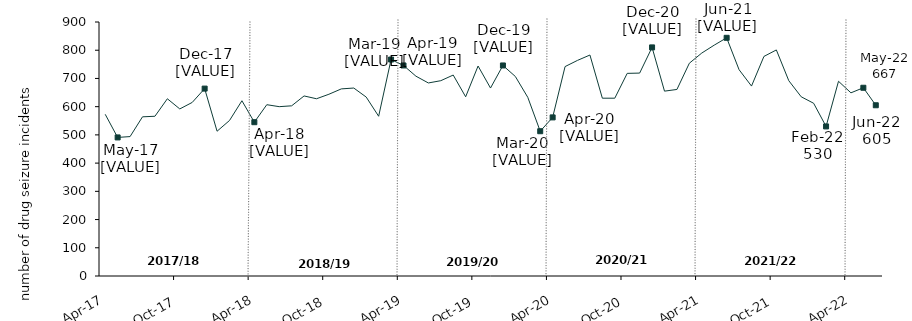
| Category | Number of drug seizure incidents |
|---|---|
| 2017-04-01 | 573 |
| 2017-05-01 | 491 |
| 2017-06-01 | 494 |
| 2017-07-01 | 564 |
| 2017-08-01 | 566 |
| 2017-09-01 | 628 |
| 2017-10-01 | 592 |
| 2017-11-01 | 615 |
| 2017-12-01 | 664 |
| 2018-01-01 | 513 |
| 2018-02-01 | 551 |
| 2018-03-01 | 621 |
| 2018-04-01 | 545 |
| 2018-05-01 | 607 |
| 2018-06-01 | 600 |
| 2018-07-01 | 603 |
| 2018-08-01 | 638 |
| 2018-09-01 | 628 |
| 2018-10-01 | 644 |
| 2018-11-01 | 663 |
| 2018-12-01 | 666 |
| 2019-01-01 | 634 |
| 2019-02-01 | 566 |
| 2019-03-01 | 767 |
| 2019-04-01 | 746 |
| 2019-05-01 | 708 |
| 2019-06-01 | 684 |
| 2019-07-01 | 692 |
| 2019-08-01 | 712 |
| 2019-09-01 | 635 |
| 2019-10-01 | 744 |
| 2019-11-01 | 666 |
| 2019-12-01 | 746 |
| 2020-01-01 | 707 |
| 2020-02-01 | 633 |
| 2020-03-01 | 513 |
| 2020-04-01 | 562 |
| 2020-05-01 | 742 |
| 2020-06-01 | 764 |
| 2020-07-01 | 783 |
| 2020-08-01 | 630 |
| 2020-09-01 | 630 |
| 2020-10-01 | 718 |
| 2020-11-01 | 719 |
| 2020-12-01 | 810 |
| 2021-01-01 | 655 |
| 2021-02-01 | 661 |
| 2021-03-01 | 754 |
| 2021-04-01 | 790 |
| 2021-05-01 | 818 |
| 2021-06-01 | 844 |
| 2021-07-01 | 731 |
| 2021-08-01 | 673 |
| 2021-09-01 | 778 |
| 2021-10-01 | 801 |
| 2021-11-01 | 692 |
| 2021-12-01 | 635 |
| 2022-01-01 | 612 |
| 2022-02-01 | 530 |
| 2022-03-01 | 690 |
| 2022-04-01 | 649 |
| 2022-05-01 | 667 |
| 2022-06-01 | 605 |